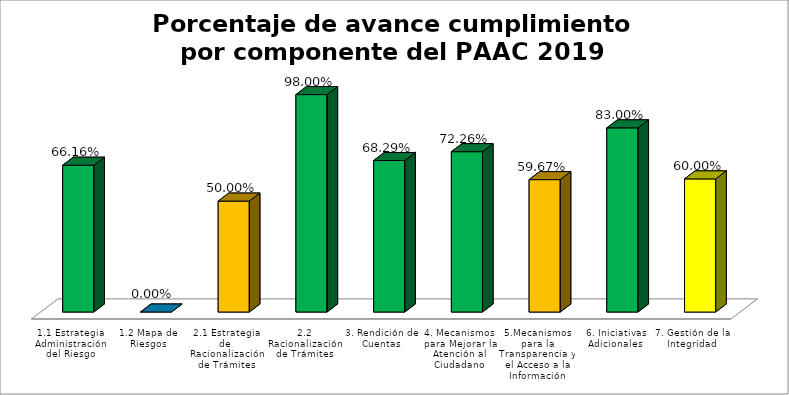
| Category | Series 0 |
|---|---|
| 1.1 Estrategia Administración del Riesgo | 0.662 |
| 1.2 Mapa de Riesgos | 0 |
| 2.1 Estrategia de  Racionalización de Trámites | 0.5 |
| 2.2 Racionalización de Trámites | 0.98 |
| 3. Rendición de Cuentas | 0.683 |
| 4. Mecanismos para Mejorar la Atención al Ciudadano | 0.723 |
| 5.Mecanismos para la Transparencia y el Acceso a la Información | 0.597 |
| 6. Iniciativas Adicionales | 0.83 |
| 7. Gestión de la Integridad  | 0.6 |